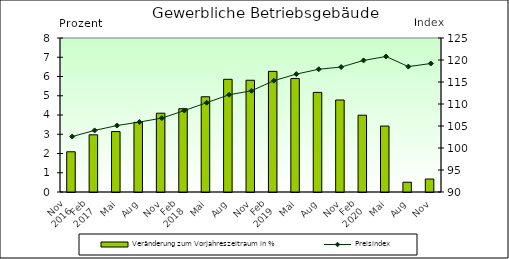
| Category | Veränderung zum Vorjahreszeitraum in % |
|---|---|
| 0 | 2.09 |
| 1 | 2.97 |
| 2 | 3.14 |
| 3 | 3.62 |
| 4 | 4.094 |
| 5 | 4.327 |
| 6 | 4.948 |
| 7 | 5.855 |
| 8 | 5.805 |
| 9 | 6.267 |
| 10 | 5.893 |
| 11 | 5.174 |
| 12 | 4.779 |
| 13 | 3.99 |
| 14 | 3.425 |
| 15 | 0.509 |
| 16 | 0.676 |